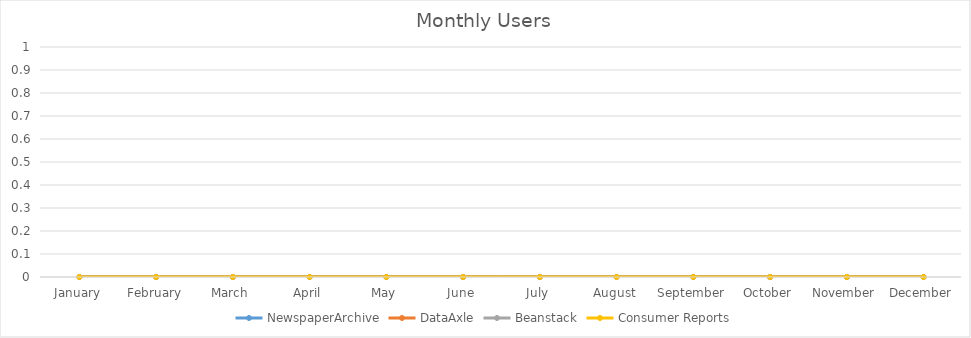
| Category | NewspaperArchive | DataAxle | Beanstack | Consumer Reports |
|---|---|---|---|---|
| 0 | 0 | 0 | 0 | 0 |
| 1 | 0 | 0 | 0 | 0 |
| 2 | 0 | 0 | 0 | 0 |
| 3 | 0 | 0 | 0 | 0 |
| 4 | 0 | 0 | 0 | 0 |
| 5 | 0 | 0 | 0 | 0 |
| 6 | 0 | 0 | 0 | 0 |
| 7 | 0 | 0 | 0 | 0 |
| 8 | 0 | 0 | 0 | 0 |
| 9 | 0 | 0 | 0 | 0 |
| 10 | 0 | 0 | 0 | 0 |
| 11 | 0 | 0 | 0 | 0 |